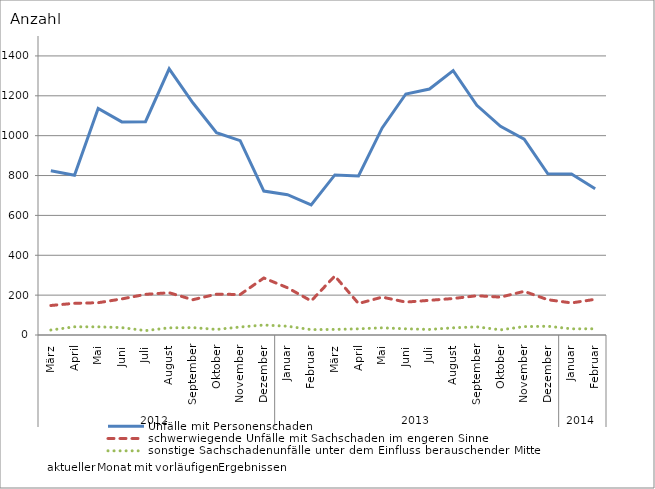
| Category | Unfälle mit Personenschaden | schwerwiegende Unfälle mit Sachschaden im engeren Sinne | sonstige Sachschadenunfälle unter dem Einfluss berauschender Mittel |
|---|---|---|---|
| 0 | 824 | 148 | 25 |
| 1 | 801 | 159 | 41 |
| 2 | 1136 | 162 | 41 |
| 3 | 1069 | 181 | 37 |
| 4 | 1070 | 204 | 22 |
| 5 | 1335 | 212 | 36 |
| 6 | 1165 | 177 | 37 |
| 7 | 1015 | 205 | 28 |
| 8 | 975 | 203 | 40 |
| 9 | 722 | 286 | 50 |
| 10 | 704 | 237 | 44 |
| 11 | 653 | 171 | 27 |
| 12 | 803 | 296 | 28 |
| 13 | 798 | 158 | 31 |
| 14 | 1039 | 190 | 36 |
| 15 | 1209 | 165 | 31 |
| 16 | 1234 | 174 | 28 |
| 17 | 1326 | 183 | 36 |
| 18 | 1152 | 197 | 41 |
| 19 | 1047 | 190 | 26 |
| 20 | 983 | 219 | 42 |
| 21 | 809 | 177 | 44 |
| 22 | 808 | 161 | 31 |
| 23 | 734 | 179 | 31 |